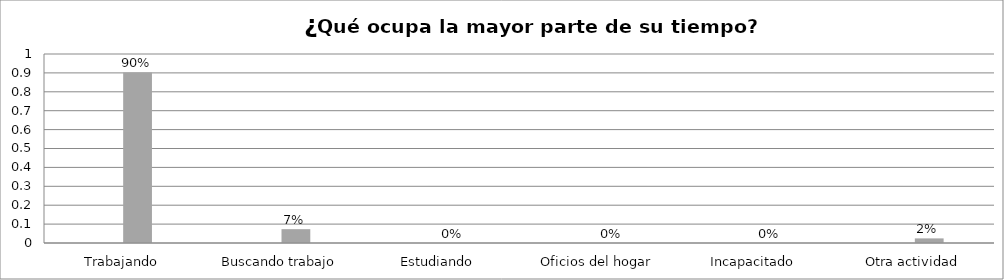
| Category | Series 0 | Series 1 | Series 2 | Series 3 |
|---|---|---|---|---|
| Trabajando |  |  | 0.902 |  |
| Buscando trabajo |  |  | 0.073 |  |
| Estudiando |  |  | 0 |  |
| Oficios del hogar |  |  | 0 |  |
| Incapacitado  |  |  | 0 |  |
| Otra actividad |  |  | 0.024 |  |